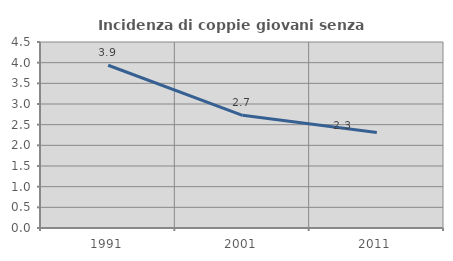
| Category | Incidenza di coppie giovani senza figli |
|---|---|
| 1991.0 | 3.938 |
| 2001.0 | 2.726 |
| 2011.0 | 2.31 |